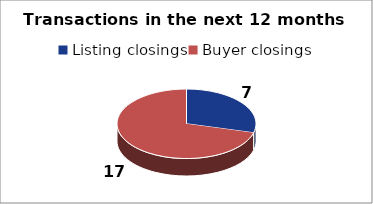
| Category | Series 0 |
|---|---|
| Listing closings | 7 |
| Buyer closings | 17 |